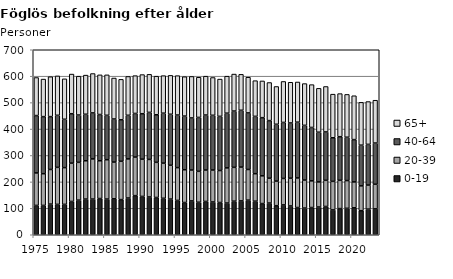
| Category | 0-19 | 20-39 | 40-64 | 65+ |
|---|---|---|---|---|
| 1975.0 | 111 | 123 | 217 | 144 |
| 1976.0 | 111 | 120 | 216 | 142 |
| 1977.0 | 116 | 131 | 200 | 151 |
| 1978.0 | 115 | 140 | 197 | 149 |
| 1979.0 | 115 | 139 | 183 | 153 |
| 1980.0 | 126 | 145 | 187 | 150 |
| 1981.0 | 131 | 143 | 179 | 147 |
| 1982.0 | 135 | 145 | 176 | 148 |
| 1983.0 | 135 | 152 | 174 | 149 |
| 1984.0 | 137 | 143 | 175 | 150 |
| 1985.0 | 135 | 149 | 168 | 153 |
| 1986.0 | 136 | 139 | 163 | 155 |
| 1987.0 | 133 | 145 | 157 | 153 |
| 1988.0 | 139 | 148 | 165 | 147 |
| 1989.0 | 148 | 146 | 165 | 143 |
| 1990.0 | 145 | 141 | 172 | 148 |
| 1991.0 | 143 | 142 | 178 | 144 |
| 1992.0 | 141 | 133 | 180 | 146 |
| 1993.0 | 138 | 133 | 189 | 142 |
| 1994.0 | 135 | 128 | 193 | 147 |
| 1995.0 | 130 | 124 | 199 | 149 |
| 1996.0 | 122 | 124 | 203 | 149 |
| 1997.0 | 128 | 117 | 197 | 157 |
| 1998.0 | 123 | 117 | 204 | 152 |
| 1999.0 | 126 | 119 | 208 | 147 |
| 2000.0 | 124 | 121 | 207 | 143 |
| 2001.0 | 122 | 121 | 205 | 141 |
| 2002.0 | 120 | 133 | 207 | 140 |
| 2003.0 | 127 | 128 | 213 | 140 |
| 2004.0 | 128 | 128 | 215 | 136 |
| 2005.0 | 131 | 116 | 214 | 135 |
| 2006.0 | 127 | 104 | 217 | 135 |
| 2007.0 | 118 | 105 | 220 | 139 |
| 2008.0 | 120 | 94 | 218 | 144 |
| 2009.0 | 110 | 93 | 215 | 143 |
| 2010.0 | 113 | 100 | 212 | 155 |
| 2011.0 | 109 | 105 | 209 | 154 |
| 2012.0 | 103 | 112 | 211 | 152 |
| 2013.0 | 101 | 106 | 207 | 158 |
| 2014.0 | 103 | 101 | 202 | 162 |
| 2015.0 | 105 | 95 | 188 | 166 |
| 2016.0 | 107 | 99 | 183 | 172 |
| 2017.0 | 94 | 108 | 165 | 165 |
| 2018.0 | 99 | 107 | 165 | 163 |
| 2019.0 | 100 | 105 | 164 | 162 |
| 2020.0 | 102 | 98 | 160 | 166 |
| 2021.0 | 91 | 94 | 154 | 162 |
| 2022.0 | 97 | 91 | 154 | 162 |
| 2023.0 | 98 | 93 | 156 | 162 |